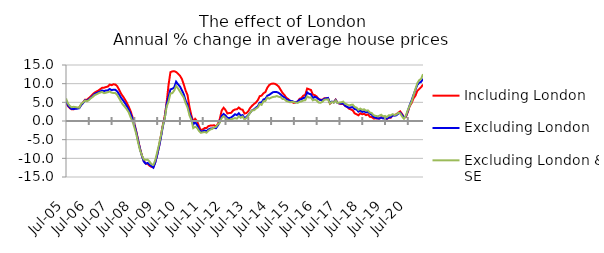
| Category | Including London | Excluding London | Excluding London & SE |
|---|---|---|---|
| 2005-07-01 | 5.042 | 5.34 | 6.041 |
| 2005-08-01 | 4.021 | 4.233 | 4.729 |
| 2005-09-01 | 3.44 | 3.609 | 4.031 |
| 2005-10-01 | 3.117 | 3.198 | 3.683 |
| 2005-11-01 | 3.119 | 3.179 | 3.804 |
| 2005-12-01 | 3.391 | 3.293 | 3.72 |
| 2006-01-01 | 3.46 | 3.314 | 3.632 |
| 2006-02-01 | 3.679 | 3.428 | 3.573 |
| 2006-03-01 | 4.36 | 4.288 | 4.578 |
| 2006-04-01 | 4.971 | 4.807 | 4.982 |
| 2006-05-01 | 5.703 | 5.549 | 5.472 |
| 2006-06-01 | 5.682 | 5.378 | 5.289 |
| 2006-07-01 | 6.13 | 5.818 | 5.553 |
| 2006-08-01 | 6.584 | 6.212 | 6.08 |
| 2006-09-01 | 7.141 | 6.725 | 6.422 |
| 2006-10-01 | 7.569 | 7.227 | 6.924 |
| 2006-11-01 | 7.9 | 7.477 | 7.14 |
| 2006-12-01 | 8.141 | 7.684 | 7.41 |
| 2007-01-01 | 8.527 | 7.906 | 7.62 |
| 2007-02-01 | 8.881 | 8.173 | 7.77 |
| 2007-03-01 | 8.911 | 8.019 | 7.457 |
| 2007-04-01 | 9.095 | 8.169 | 7.568 |
| 2007-05-01 | 9.213 | 8.204 | 7.716 |
| 2007-06-01 | 9.739 | 8.578 | 7.871 |
| 2007-07-01 | 9.603 | 8.264 | 7.598 |
| 2007-08-01 | 9.834 | 8.384 | 7.471 |
| 2007-09-01 | 9.759 | 8.353 | 7.476 |
| 2007-10-01 | 9.31 | 7.908 | 6.946 |
| 2007-11-01 | 8.338 | 7.116 | 6.089 |
| 2007-12-01 | 7.301 | 6.209 | 5.13 |
| 2008-01-01 | 6.594 | 5.569 | 4.358 |
| 2008-02-01 | 5.803 | 4.819 | 3.807 |
| 2008-03-01 | 4.897 | 4.031 | 3.135 |
| 2008-04-01 | 3.869 | 3.081 | 2.34 |
| 2008-05-01 | 2.669 | 1.982 | 1.042 |
| 2008-06-01 | 1.104 | 0.608 | -0.088 |
| 2008-07-01 | -0.68 | -0.992 | -1.674 |
| 2008-08-01 | -2.784 | -3 | -3.489 |
| 2008-09-01 | -5.142 | -5.294 | -5.824 |
| 2008-10-01 | -7.4 | -7.555 | -7.844 |
| 2008-11-01 | -9.283 | -9.376 | -9.246 |
| 2008-12-01 | -10.716 | -10.891 | -10.295 |
| 2009-01-01 | -11.416 | -11.431 | -10.399 |
| 2009-02-01 | -11.461 | -11.235 | -10.34 |
| 2009-03-01 | -11.986 | -11.748 | -10.864 |
| 2009-04-01 | -12.284 | -12.069 | -11.542 |
| 2009-05-01 | -12.391 | -12.497 | -11.751 |
| 2009-06-01 | -11.045 | -11.133 | -10.506 |
| 2009-07-01 | -9.035 | -9.204 | -8.454 |
| 2009-08-01 | -6.756 | -6.883 | -6.256 |
| 2009-09-01 | -3.959 | -4.358 | -3.813 |
| 2009-10-01 | -1.05 | -1.44 | -1.209 |
| 2009-11-01 | 1.332 | 0.762 | 0.706 |
| 2009-12-01 | 4.938 | 4.524 | 3.867 |
| 2010-01-01 | 9.666 | 6.473 | 5.237 |
| 2010-02-01 | 13.087 | 8.483 | 7.361 |
| 2010-03-01 | 13.284 | 8.635 | 7.462 |
| 2010-04-01 | 13.336 | 9.008 | 8.16 |
| 2010-05-01 | 13.12 | 10.528 | 9.387 |
| 2010-06-01 | 12.672 | 9.826 | 8.722 |
| 2010-07-01 | 12.136 | 9.253 | 7.893 |
| 2010-08-01 | 11.285 | 8.267 | 7.079 |
| 2010-09-01 | 9.83 | 7.192 | 6.308 |
| 2010-10-01 | 8.132 | 5.464 | 4.764 |
| 2010-11-01 | 6.944 | 4.376 | 3.643 |
| 2010-12-01 | 3.828 | 2.165 | 1.541 |
| 2011-01-01 | 1.555 | 0.94 | 0.308 |
| 2011-02-01 | -0.145 | -0.932 | -1.901 |
| 2011-03-01 | 0.576 | -0.311 | -1.539 |
| 2011-04-01 | -0.047 | -0.98 | -1.825 |
| 2011-05-01 | -1.375 | -2.157 | -2.653 |
| 2011-06-01 | -2.44 | -2.862 | -3.172 |
| 2011-07-01 | -2.248 | -2.732 | -3.038 |
| 2011-08-01 | -1.902 | -2.534 | -2.957 |
| 2011-09-01 | -1.894 | -2.72 | -3.136 |
| 2011-10-01 | -1.375 | -2.271 | -2.601 |
| 2011-11-01 | -1.232 | -2.041 | -2.302 |
| 2011-12-01 | -1.216 | -1.983 | -2.078 |
| 2012-01-01 | -1.135 | -1.817 | -1.736 |
| 2012-02-01 | -1.498 | -1.938 | -1.562 |
| 2012-03-01 | -0.754 | -1.159 | -0.865 |
| 2012-04-01 | 0.568 | -0.199 | -0.449 |
| 2012-05-01 | 2.809 | 1.391 | 0.799 |
| 2012-06-01 | 3.555 | 1.895 | 1.279 |
| 2012-07-01 | 2.96 | 1.471 | 0.853 |
| 2012-08-01 | 2.016 | 0.846 | 0.405 |
| 2012-09-01 | 2.155 | 0.788 | 0.262 |
| 2012-10-01 | 2.185 | 0.951 | 0.468 |
| 2012-11-01 | 2.83 | 1.343 | 0.606 |
| 2012-12-01 | 3.097 | 1.815 | 0.771 |
| 2013-01-01 | 3.135 | 1.584 | 0.626 |
| 2013-02-01 | 3.621 | 2.089 | 1.281 |
| 2013-03-01 | 3.142 | 1.441 | 0.855 |
| 2013-04-01 | 3.02 | 1.582 | 1.19 |
| 2013-05-01 | 1.989 | 0.799 | 0.359 |
| 2013-06-01 | 2.137 | 1.065 | 0.812 |
| 2013-07-01 | 2.63 | 1.589 | 1.441 |
| 2013-08-01 | 3.53 | 2.237 | 2.195 |
| 2013-09-01 | 4.078 | 2.856 | 2.882 |
| 2013-10-01 | 4.553 | 3.114 | 2.858 |
| 2013-11-01 | 4.94 | 3.551 | 3.342 |
| 2013-12-01 | 5.579 | 3.95 | 3.611 |
| 2014-01-01 | 6.635 | 4.909 | 4.55 |
| 2014-02-01 | 6.792 | 4.951 | 4.317 |
| 2014-03-01 | 7.439 | 5.778 | 5.291 |
| 2014-04-01 | 7.743 | 5.942 | 5.355 |
| 2014-05-01 | 8.904 | 6.758 | 6.25 |
| 2014-06-01 | 9.611 | 6.997 | 5.99 |
| 2014-07-01 | 9.945 | 7.369 | 6.241 |
| 2014-08-01 | 10.028 | 7.718 | 6.454 |
| 2014-09-01 | 9.975 | 7.779 | 6.477 |
| 2014-10-01 | 9.664 | 7.742 | 6.706 |
| 2014-11-01 | 9.231 | 7.538 | 6.472 |
| 2014-12-01 | 8.388 | 7.121 | 6.415 |
| 2015-01-01 | 7.539 | 6.66 | 5.914 |
| 2015-02-01 | 6.987 | 6.347 | 5.865 |
| 2015-03-01 | 6.235 | 5.859 | 5.371 |
| 2015-04-01 | 5.903 | 5.625 | 5.209 |
| 2015-05-01 | 5.319 | 5.414 | 5.019 |
| 2015-06-01 | 5.063 | 5.36 | 5.165 |
| 2015-07-01 | 4.841 | 5.099 | 5.035 |
| 2015-08-01 | 5.049 | 5.02 | 4.945 |
| 2015-09-01 | 5.228 | 5.181 | 4.854 |
| 2015-10-01 | 5.945 | 5.722 | 5.13 |
| 2015-11-01 | 6.153 | 5.836 | 5.253 |
| 2015-12-01 | 6.8 | 6.158 | 5.481 |
| 2016-01-01 | 7.002 | 6.247 | 5.577 |
| 2016-02-01 | 8.699 | 7.668 | 6.574 |
| 2016-03-01 | 8.503 | 7.286 | 6.288 |
| 2016-04-01 | 8.297 | 7.185 | 6.274 |
| 2016-05-01 | 7.068 | 6.166 | 5.521 |
| 2016-06-01 | 6.929 | 6.468 | 5.771 |
| 2016-07-01 | 6.559 | 6.28 | 5.487 |
| 2016-08-01 | 5.89 | 5.868 | 4.963 |
| 2016-09-01 | 5.707 | 5.601 | 4.885 |
| 2016-10-01 | 5.664 | 5.564 | 5.144 |
| 2016-11-01 | 6.074 | 5.931 | 5.679 |
| 2016-12-01 | 6.088 | 6.062 | 5.778 |
| 2017-01-01 | 6.111 | 6.173 | 5.796 |
| 2017-02-01 | 4.642 | 4.809 | 4.672 |
| 2017-03-01 | 5.09 | 5.198 | 5.12 |
| 2017-04-01 | 5.035 | 4.991 | 4.889 |
| 2017-05-01 | 5.716 | 5.642 | 5.503 |
| 2017-06-01 | 4.885 | 4.822 | 4.83 |
| 2017-07-01 | 4.672 | 4.724 | 4.935 |
| 2017-08-01 | 4.534 | 4.684 | 5.029 |
| 2017-09-01 | 4.581 | 4.691 | 5.187 |
| 2017-10-01 | 4.038 | 4.087 | 4.605 |
| 2017-11-01 | 3.791 | 3.804 | 4.428 |
| 2017-12-01 | 3.316 | 3.568 | 4.181 |
| 2018-01-01 | 3.101 | 3.644 | 4.305 |
| 2018-02-01 | 2.859 | 3.721 | 4.385 |
| 2018-03-01 | 2.042 | 3.184 | 3.756 |
| 2018-04-01 | 1.799 | 3.088 | 3.583 |
| 2018-05-01 | 1.526 | 2.518 | 2.976 |
| 2018-06-01 | 2.077 | 2.852 | 3.328 |
| 2018-07-01 | 1.803 | 2.439 | 2.991 |
| 2018-08-01 | 1.927 | 2.588 | 3.142 |
| 2018-09-01 | 1.565 | 2.31 | 2.754 |
| 2018-10-01 | 1.775 | 2.499 | 2.852 |
| 2018-11-01 | 1.139 | 1.997 | 2.267 |
| 2018-12-01 | 1.06 | 1.682 | 2.127 |
| 2019-01-01 | 0.665 | 1.094 | 1.545 |
| 2019-02-01 | 0.706 | 0.878 | 1.379 |
| 2019-03-01 | 0.67 | 0.735 | 1.277 |
| 2019-04-01 | 0.683 | 0.644 | 1.394 |
| 2019-05-01 | 0.984 | 0.937 | 1.68 |
| 2019-06-01 | 0.764 | 0.693 | 1.225 |
| 2019-07-01 | 0.911 | 0.933 | 1.357 |
| 2019-08-01 | 0.574 | 0.618 | 1.052 |
| 2019-09-01 | 0.867 | 0.962 | 1.554 |
| 2019-10-01 | 0.878 | 0.988 | 1.49 |
| 2019-11-01 | 1.508 | 1.487 | 1.829 |
| 2019-12-01 | 1.563 | 1.439 | 1.614 |
| 2020-01-01 | 1.832 | 1.54 | 1.737 |
| 2020-02-01 | 2.23 | 1.986 | 2.193 |
| 2020-03-01 | 2.588 | 2.218 | 2.036 |
| 2020-04-01 | 1.85 | 1.645 | 1.195 |
| 2020-05-01 | 0.936 | 0.912 | 0.576 |
| 2020-06-01 | 1.088 | 1.264 | 1.491 |
| 2020-07-01 | 2.416 | 2.681 | 2.883 |
| 2020-08-01 | 3.969 | 4.239 | 4.115 |
| 2020-09-01 | 4.812 | 5.505 | 5.174 |
| 2020-10-01 | 6.068 | 7.019 | 6.862 |
| 2020-11-01 | 6.759 | 8.309 | 8.562 |
| 2020-12-01 | 8.064 | 9.646 | 10.112 |
| 2021-01-01 | 8.563 | 10.266 | 10.945 |
| 2021-02-01 | 9.056 | 10.479 | 11.248 |
| 2021-03-01 | 9.759 | 11.288 | 12.549 |